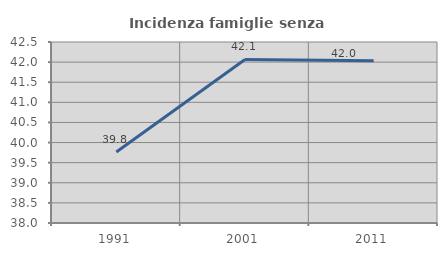
| Category | Incidenza famiglie senza nuclei |
|---|---|
| 1991.0 | 39.763 |
| 2001.0 | 42.067 |
| 2011.0 | 42.033 |